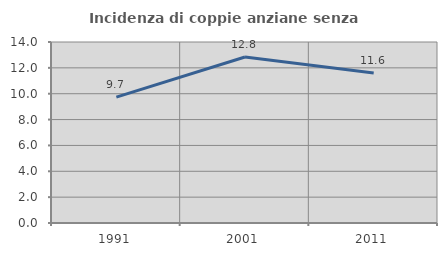
| Category | Incidenza di coppie anziane senza figli  |
|---|---|
| 1991.0 | 9.732 |
| 2001.0 | 12.84 |
| 2011.0 | 11.605 |